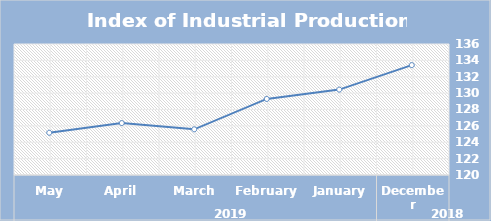
| Category | Index |
|---|---|
| 0 | 133.42 |
| 1 | 130.43 |
| 2 | 129.29 |
| 3 | 125.58 |
| 4 | 126.34 |
| 5 | 125.16 |